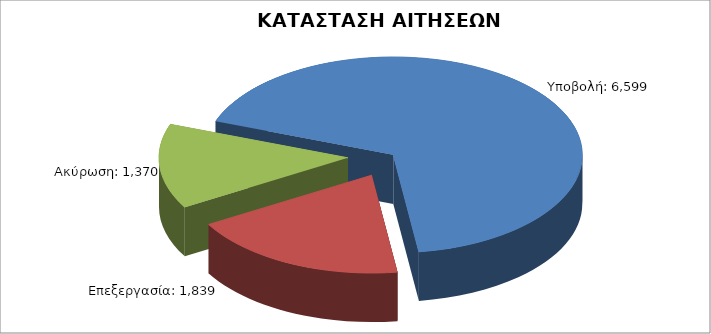
| Category | Series 0 |
|---|---|
| Υποβολή: | 6599 |
| Επεξεργασία: | 1839 |
| Ακύρωση: | 1370 |